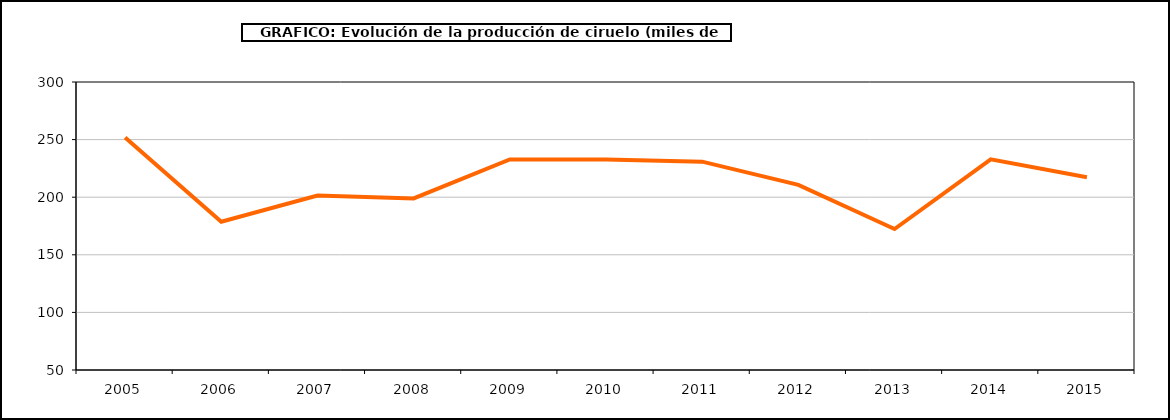
| Category | producción Ciruelo |
|---|---|
| 2005.0 | 251.812 |
| 2006.0 | 178.705 |
| 2007.0 | 201.392 |
| 2008.0 | 198.948 |
| 2009.0 | 232.78 |
| 2010.0 | 232.78 |
| 2011.0 | 230.877 |
| 2012.0 | 210.726 |
| 2013.0 | 172.352 |
| 2014.0 | 232.831 |
| 2015.0 | 217.291 |